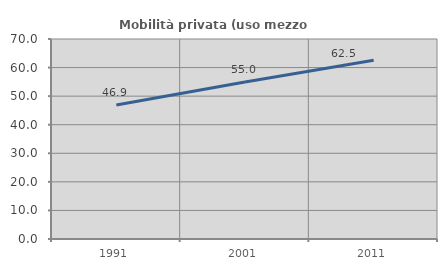
| Category | Mobilità privata (uso mezzo privato) |
|---|---|
| 1991.0 | 46.903 |
| 2001.0 | 54.976 |
| 2011.0 | 62.538 |